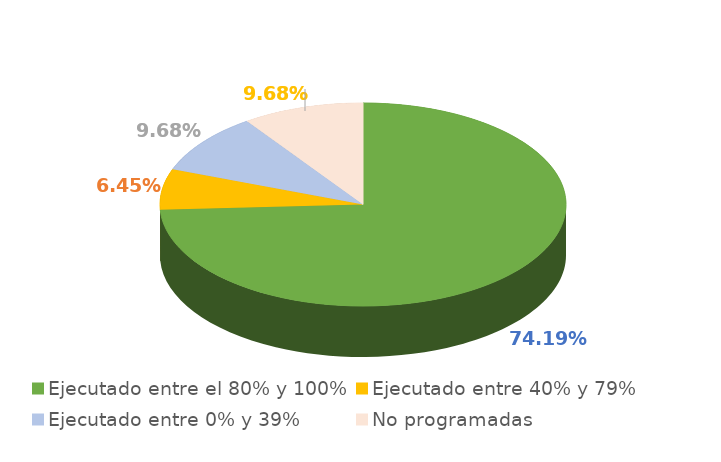
| Category | Series 0 |
|---|---|
| Ejecutado entre el 80% y 100% | 0.742 |
| Ejecutado entre 40% y 79% | 0.065 |
| Ejecutado entre 0% y 39% | 0.097 |
| No programadas | 0.097 |